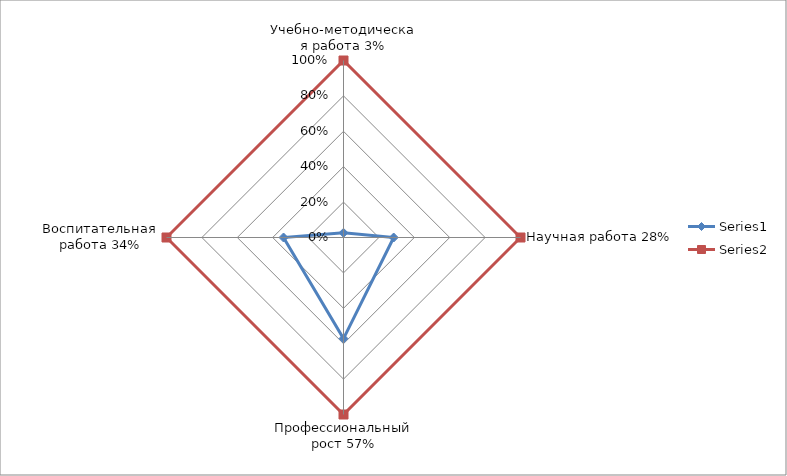
| Category | Series 0 | Series 1 |
|---|---|---|
| Учебно-методическая работа 3% | 0.027 | 1 |
| Научная работа 28% | 0.284 | 1 |
| Профессиональный рост 57% | 0.571 | 1 |
| Воспитательная работа 34% | 0.339 | 1 |